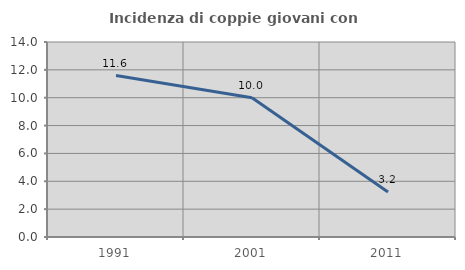
| Category | Incidenza di coppie giovani con figli |
|---|---|
| 1991.0 | 11.594 |
| 2001.0 | 10 |
| 2011.0 | 3.226 |